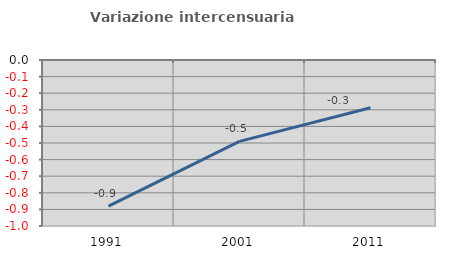
| Category | Variazione intercensuaria annua |
|---|---|
| 1991.0 | -0.88 |
| 2001.0 | -0.49 |
| 2011.0 | -0.288 |